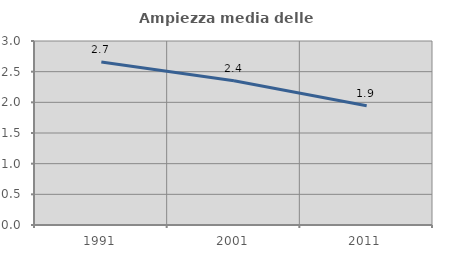
| Category | Ampiezza media delle famiglie |
|---|---|
| 1991.0 | 2.657 |
| 2001.0 | 2.352 |
| 2011.0 | 1.945 |